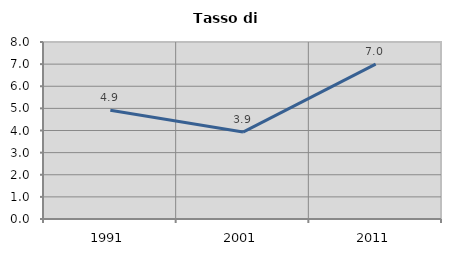
| Category | Tasso di disoccupazione   |
|---|---|
| 1991.0 | 4.918 |
| 2001.0 | 3.93 |
| 2011.0 | 6.998 |